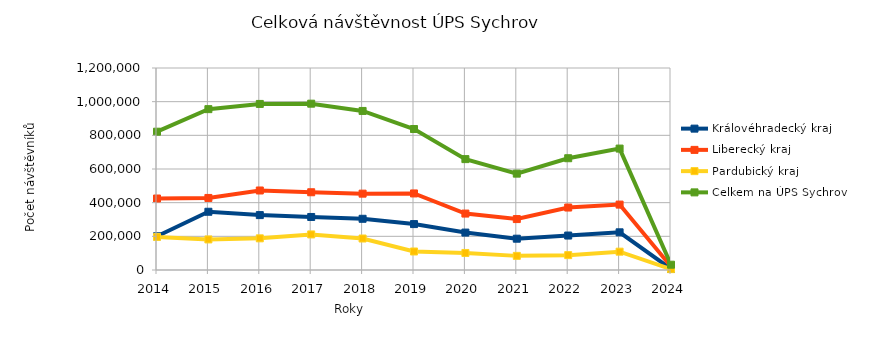
| Category | Královéhradecký kraj | Liberecký kraj | Pardubický kraj | Celkem na ÚPS Sychrov |
|---|---|---|---|---|
| 2014.0 | 200438 | 424718 | 196473 | 821629 |
| 2015.0 | 345970 | 428023 | 181567 | 955560 |
| 2016.0 | 326137 | 472318 | 188108 | 986563 |
| 2017.0 | 314983 | 461803 | 211268 | 988054 |
| 2018.0 | 304267 | 453568 | 187017 | 944852 |
| 2019.0 | 272720 | 454785 | 109949 | 837454 |
| 2020.0 | 222238 | 335261 | 101211 | 658710 |
| 2021.0 | 185934 | 302574 | 83925 | 572433 |
| 2022.0 | 204678 | 371041 | 88282 | 664001 |
| 2023.0 | 223799 | 388530 | 108959 | 721288 |
| 2024.0 | 6123 | 20241 | 5183 | 31547 |